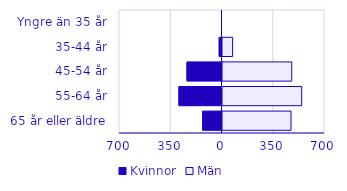
| Category | Kvinnor | Män |
|---|---|---|
| 0 | 0 | 0 |
| 1 | -19 | 69 |
| 2 | -239 | 473 |
| 3 | -294 | 541 |
| 4 | -132 | 468 |